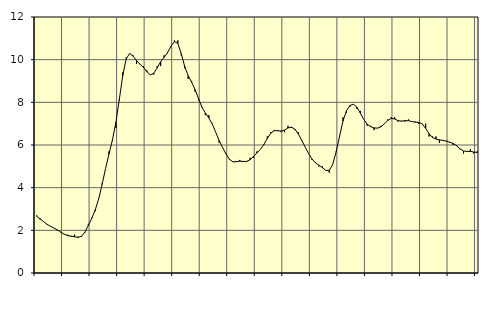
| Category | Piggar | Series 1 |
|---|---|---|
| nan | 2.7 | 2.65 |
| 87.0 | 2.5 | 2.54 |
| 87.0 | 2.4 | 2.41 |
| 87.0 | 2.3 | 2.28 |
| nan | 2.2 | 2.19 |
| 88.0 | 2.1 | 2.11 |
| 88.0 | 2 | 2.02 |
| 88.0 | 1.9 | 1.92 |
| nan | 1.8 | 1.82 |
| 89.0 | 1.8 | 1.75 |
| 89.0 | 1.7 | 1.73 |
| 89.0 | 1.8 | 1.7 |
| nan | 1.7 | 1.67 |
| 90.0 | 1.7 | 1.72 |
| 90.0 | 1.9 | 1.92 |
| 90.0 | 2.3 | 2.23 |
| nan | 2.6 | 2.57 |
| 91.0 | 2.9 | 2.95 |
| 91.0 | 3.5 | 3.48 |
| 91.0 | 4.2 | 4.15 |
| nan | 4.9 | 4.9 |
| 92.0 | 5.7 | 5.58 |
| 92.0 | 6.2 | 6.24 |
| 92.0 | 6.8 | 7.06 |
| nan | 8.1 | 8.14 |
| 93.0 | 9.4 | 9.26 |
| 93.0 | 10.1 | 10.04 |
| 93.0 | 10.3 | 10.29 |
| nan | 10.2 | 10.17 |
| 94.0 | 9.8 | 9.95 |
| 94.0 | 9.8 | 9.79 |
| 94.0 | 9.7 | 9.64 |
| nan | 9.5 | 9.43 |
| 95.0 | 9.3 | 9.29 |
| 95.0 | 9.3 | 9.36 |
| 95.0 | 9.7 | 9.62 |
| nan | 9.7 | 9.9 |
| 96.0 | 10.2 | 10.11 |
| 96.0 | 10.3 | 10.33 |
| 96.0 | 10.6 | 10.63 |
| nan | 10.9 | 10.85 |
| 97.0 | 10.9 | 10.76 |
| 97.0 | 10.2 | 10.28 |
| 97.0 | 9.6 | 9.68 |
| nan | 9.1 | 9.25 |
| 98.0 | 9 | 8.95 |
| 98.0 | 8.5 | 8.6 |
| 98.0 | 8.1 | 8.18 |
| nan | 7.8 | 7.77 |
| 99.0 | 7.4 | 7.5 |
| 99.0 | 7.4 | 7.27 |
| 99.0 | 7 | 6.98 |
| nan | 6.6 | 6.6 |
| 0.0 | 6.1 | 6.21 |
| 0.0 | 5.9 | 5.88 |
| 0.0 | 5.6 | 5.58 |
| nan | 5.3 | 5.33 |
| 1.0 | 5.2 | 5.21 |
| 1.0 | 5.2 | 5.22 |
| 1.0 | 5.3 | 5.24 |
| nan | 5.2 | 5.23 |
| 2.0 | 5.2 | 5.23 |
| 2.0 | 5.4 | 5.31 |
| 2.0 | 5.4 | 5.47 |
| nan | 5.7 | 5.63 |
| 3.0 | 5.8 | 5.8 |
| 3.0 | 6 | 6.03 |
| 3.0 | 6.4 | 6.31 |
| nan | 6.6 | 6.55 |
| 4.0 | 6.7 | 6.67 |
| 4.0 | 6.7 | 6.67 |
| 4.0 | 6.6 | 6.65 |
| nan | 6.6 | 6.7 |
| 5.0 | 6.9 | 6.8 |
| 5.0 | 6.8 | 6.84 |
| 5.0 | 6.7 | 6.74 |
| nan | 6.6 | 6.52 |
| 6.0 | 6.2 | 6.22 |
| 6.0 | 5.9 | 5.9 |
| 6.0 | 5.6 | 5.6 |
| nan | 5.3 | 5.34 |
| 7.0 | 5.2 | 5.16 |
| 7.0 | 5 | 5.05 |
| 7.0 | 5 | 4.94 |
| nan | 4.8 | 4.81 |
| 8.0 | 4.7 | 4.81 |
| 8.0 | 5.1 | 5.09 |
| 8.0 | 5.7 | 5.68 |
| nan | 6.4 | 6.42 |
| 9.0 | 7.3 | 7.13 |
| 9.0 | 7.5 | 7.61 |
| 9.0 | 7.8 | 7.85 |
| nan | 7.9 | 7.91 |
| 10.0 | 7.7 | 7.78 |
| 10.0 | 7.6 | 7.5 |
| 10.0 | 7.2 | 7.2 |
| nan | 6.9 | 6.98 |
| 11.0 | 6.9 | 6.86 |
| 11.0 | 6.7 | 6.8 |
| 11.0 | 6.8 | 6.79 |
| nan | 6.9 | 6.85 |
| 12.0 | 7 | 6.99 |
| 12.0 | 7.2 | 7.15 |
| 12.0 | 7.3 | 7.25 |
| nan | 7.3 | 7.22 |
| 13.0 | 7.1 | 7.14 |
| 13.0 | 7.1 | 7.12 |
| 13.0 | 7.1 | 7.14 |
| nan | 7.2 | 7.14 |
| 14.0 | 7.1 | 7.1 |
| 14.0 | 7.1 | 7.07 |
| 14.0 | 7 | 7.06 |
| nan | 7 | 6.99 |
| 15.0 | 7 | 6.78 |
| 15.0 | 6.4 | 6.53 |
| 15.0 | 6.4 | 6.35 |
| nan | 6.4 | 6.28 |
| 16.0 | 6.1 | 6.24 |
| 16.0 | 6.2 | 6.22 |
| 16.0 | 6.2 | 6.18 |
| nan | 6.1 | 6.13 |
| 17.0 | 6 | 6.07 |
| 17.0 | 6 | 5.96 |
| 17.0 | 5.8 | 5.82 |
| nan | 5.6 | 5.72 |
| 18.0 | 5.7 | 5.7 |
| 18.0 | 5.8 | 5.7 |
| 18.0 | 5.6 | 5.67 |
| nan | 5.7 | 5.65 |